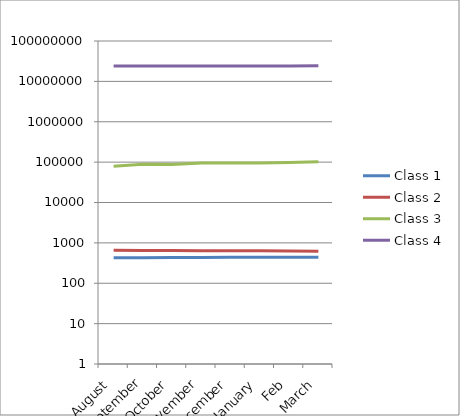
| Category | Class 1 | Class 2 | Class 3 | Class 4 |
|---|---|---|---|---|
| August | 427 | 655 | 78827 | 24101362 |
| September | 429 | 650 | 88860 | 24110132 |
| October | 433 | 645 | 87615 | 24128941 |
| November | 437 | 636 | 95286 | 24146202 |
| December | 438 | 639 | 95544 | 24160382 |
| January | 441 | 638 | 95568 | 24173580 |
| Feb | 441 | 633 | 98369 | 24197837 |
| March | 441 | 620 | 101910 | 24264887 |